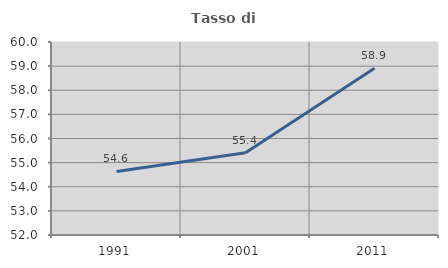
| Category | Tasso di occupazione   |
|---|---|
| 1991.0 | 54.633 |
| 2001.0 | 55.411 |
| 2011.0 | 58.916 |